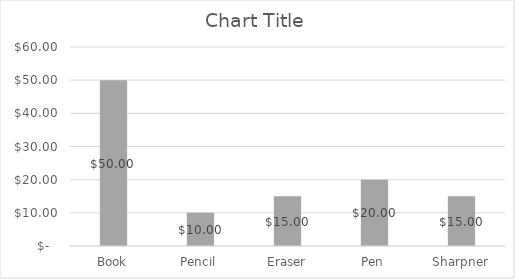
| Category | Series 0 |
|---|---|
| Book | 50 |
| Pencil | 10 |
| Eraser | 15 |
| Pen | 20 |
| Sharpner | 15 |